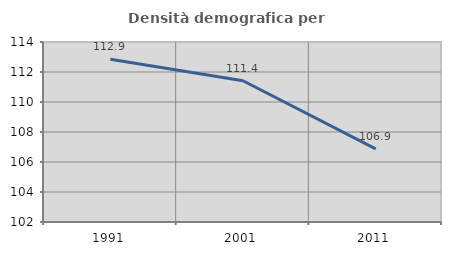
| Category | Densità demografica |
|---|---|
| 1991.0 | 112.854 |
| 2001.0 | 111.419 |
| 2011.0 | 106.873 |